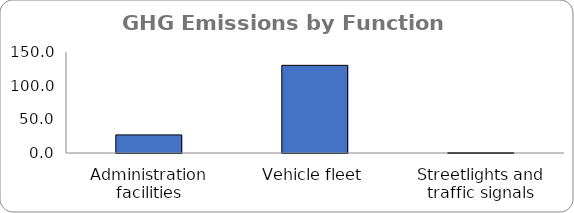
| Category | Series 0 |
|---|---|
| Administration facilities | 26.894 |
| Vehicle fleet | 130.188 |
| Streetlights and traffic signals | 0.537 |